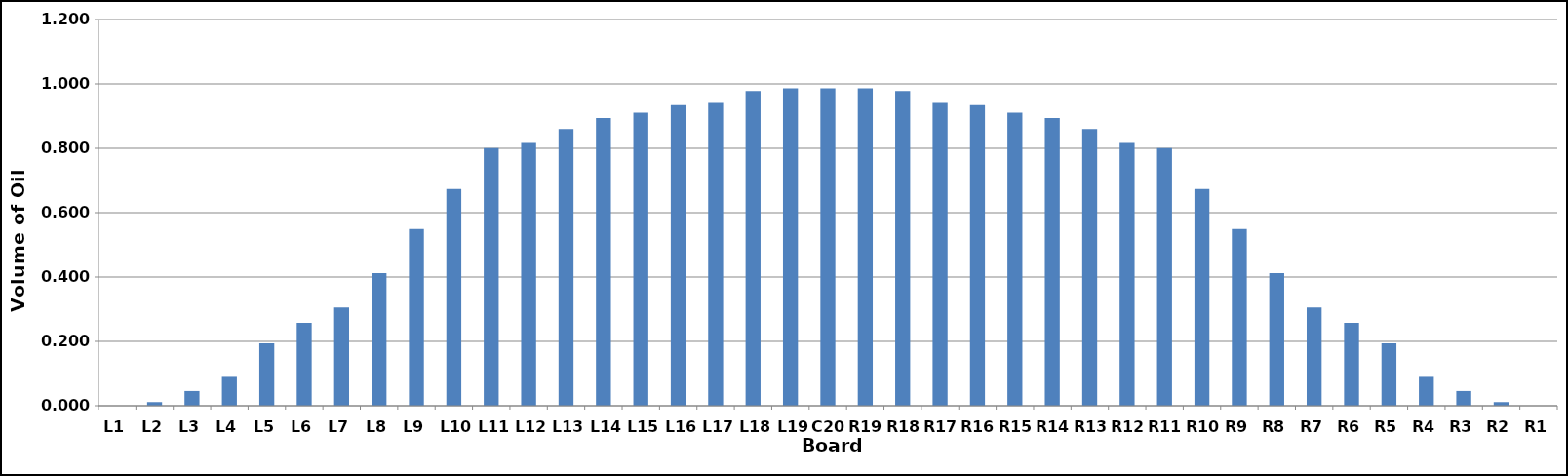
| Category | Series 0 |
|---|---|
| L1 | 0 |
| L2 | 0.011 |
| L3 | 0.046 |
| L4 | 0.093 |
| L5 | 0.194 |
| L6 | 0.258 |
| L7 | 0.305 |
| L8 | 0.412 |
| L9 | 0.549 |
| L10 | 0.673 |
| L11 | 0.801 |
| L12 | 0.817 |
| L13 | 0.86 |
| L14 | 0.894 |
| L15 | 0.91 |
| L16 | 0.934 |
| L17 | 0.941 |
| L18 | 0.978 |
| L19 | 0.987 |
| C20 | 0.987 |
| R19 | 0.987 |
| R18 | 0.978 |
| R17 | 0.941 |
| R16 | 0.934 |
| R15 | 0.91 |
| R14 | 0.894 |
| R13 | 0.86 |
| R12 | 0.817 |
| R11 | 0.801 |
| R10 | 0.673 |
| R9 | 0.549 |
| R8 | 0.412 |
| R7 | 0.305 |
| R6 | 0.258 |
| R5 | 0.194 |
| R4 | 0.093 |
| R3 | 0.046 |
| R2 | 0.011 |
| R1 | 0 |